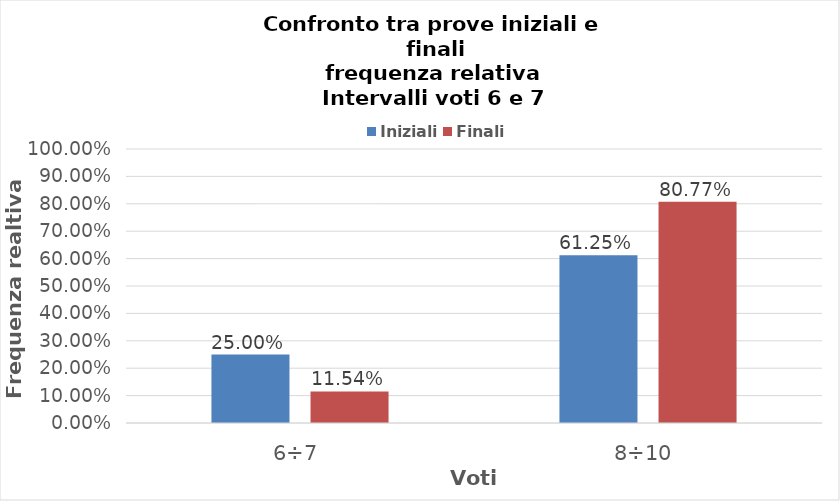
| Category | Iniziali | Finali |
|---|---|---|
| 6÷7 | 0.25 | 0.115 |
| 8÷10 | 0.612 | 0.808 |